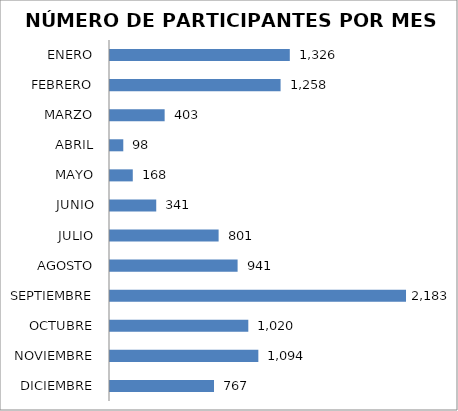
| Category | Series 0 |
|---|---|
| ENERO | 1326 |
| FEBRERO | 1258 |
| MARZO | 403 |
| ABRIL | 98 |
| MAYO | 168 |
| JUNIO | 341 |
| JULIO | 801 |
| AGOSTO | 941 |
| SEPTIEMBRE | 2183 |
| OCTUBRE | 1020 |
| NOVIEMBRE | 1094 |
| DICIEMBRE | 767 |